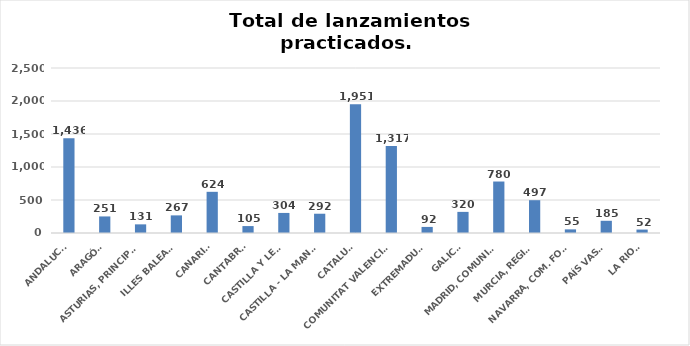
| Category | Series 0 |
|---|---|
| ANDALUCÍA | 1436 |
| ARAGÓN | 251 |
| ASTURIAS, PRINCIPADO | 131 |
| ILLES BALEARS | 267 |
| CANARIAS | 624 |
| CANTABRIA | 105 |
| CASTILLA Y LEÓN | 304 |
| CASTILLA - LA MANCHA | 292 |
| CATALUÑA | 1951 |
| COMUNITAT VALENCIANA | 1317 |
| EXTREMADURA | 92 |
| GALICIA | 320 |
| MADRID, COMUNIDAD | 780 |
| MURCIA, REGIÓN | 497 |
| NAVARRA, COM. FORAL | 55 |
| PAÍS VASCO | 185 |
| LA RIOJA | 52 |